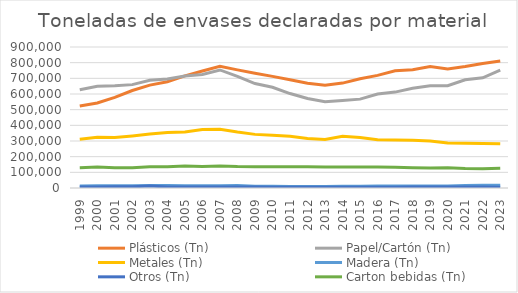
| Category | Plásticos (Tn) | Papel/Cartón (Tn) | Metales (Tn) | Madera (Tn) | Otros (Tn) | Carton bebidas (Tn) |
|---|---|---|---|---|---|---|
| 1999.0 | 523597.578 | 626823.215 | 311602.981 | 12936.065 | 6777.49 | 129459.805 |
| 2000.0 | 542914.566 | 649583.195 | 324260.977 | 13745.796 | 7008.358 | 133831.843 |
| 2001.0 | 578152.471 | 652352.597 | 322066.288 | 13952.42 | 7638.109 | 129253.762 |
| 2002.0 | 622381.15 | 659780.47 | 332136.33 | 14068.48 | 7238.649 | 129352.97 |
| 2003.0 | 656596.65 | 687723.8 | 344467.12 | 15755.3 | 12694 | 135155.71 |
| 2004.0 | 678455.897 | 695175.837 | 354710.524 | 15952.993 | 6175.62 | 135992.697 |
| 2005.0 | 715824.901 | 714212.309 | 358022.732 | 14789.557 | 6859.957 | 141068.483 |
| 2006.0 | 746752.135 | 724061.533 | 373237.448 | 14391.931 | 6424.75 | 137724.182 |
| 2007.0 | 777403.62 | 753472.17 | 374729.41 | 15042.56 | 5913.63 | 140758.61 |
| 2008.0 | 753822.16 | 713018.37 | 357150.09 | 15603.9 | 5934.56 | 136684.07 |
| 2009.0 | 732626.26 | 666894.39 | 342257.46 | 10993.21 | 6304.08 | 135085.97 |
| 2010.0 | 712641.813 | 643110.039 | 336529.729 | 11290.503 | 5464.651 | 135628.317 |
| 2011.0 | 691227.341 | 602955.259 | 330548.086 | 10268.576 | 5349.775 | 136291.474 |
| 2012.0 | 668692.095 | 570878.09 | 316293.937 | 10321.353 | 4756.885 | 135570.488 |
| 2013.0 | 655828.216 | 550430.325 | 309186.279 | 9741.048 | 4189.424 | 133539.263 |
| 2014.0 | 669491.637 | 558173.731 | 330560.602 | 11307.662 | 4348.173 | 133382.971 |
| 2015.0 | 697650.387 | 567284.946 | 322929.58 | 11753.676 | 4542.979 | 133280.56 |
| 2016.0 | 718840.771 | 599837.18 | 308332.026 | 12413.259 | 4724.623 | 133890.675 |
| 2017.0 | 747922.404 | 612182.407 | 306414.321 | 12345.502 | 5000.223 | 131999.239 |
| 2018.0 | 754764.326 | 636924.098 | 304327.232 | 12572.902 | 5724.151 | 129109.999 |
| 2019.0 | 775846.743 | 653127.009 | 300114.574 | 13022.726 | 7151.445 | 127007.563 |
| 2020.0 | 759225.063 | 652721.128 | 286892.666 | 12216.439 | 5838.699 | 129870.637 |
| 2021.0 | 775453.968 | 690832.337 | 285935.516 | 15195.888 | 5751.941 | 124545.549 |
| 2022.0 | 794607.673 | 703136.089 | 283656.031 | 17885.917 | 5691.648 | 122464.318 |
| 2023.0 | 811039.605 | 751849.139 | 281725.15 | 17707.215 | 5404.533 | 125886.984 |